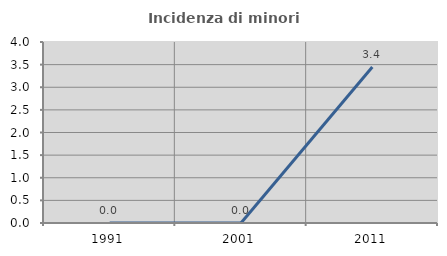
| Category | Incidenza di minori stranieri |
|---|---|
| 1991.0 | 0 |
| 2001.0 | 0 |
| 2011.0 | 3.448 |